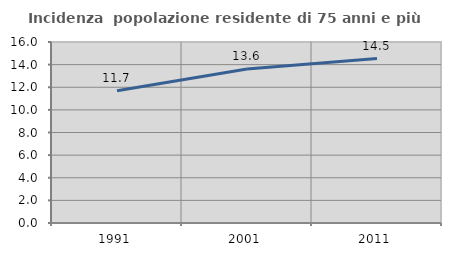
| Category | Incidenza  popolazione residente di 75 anni e più |
|---|---|
| 1991.0 | 11.692 |
| 2001.0 | 13.605 |
| 2011.0 | 14.54 |